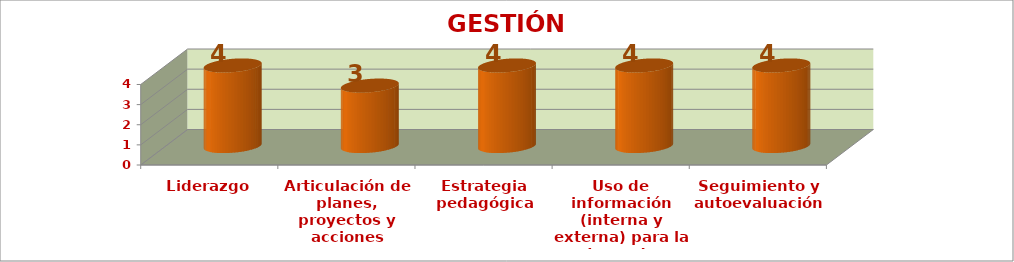
| Category | GESTIÓN ESTRATÉGICA |
|---|---|
| Liderazgo | 4 |
| Articulación de planes,
proyectos y acciones | 3 |
| Estrategia pedagógica | 4 |
| Uso de información (interna y externa) para la toma de
decisiones | 4 |
| Seguimiento y autoevaluación | 4 |